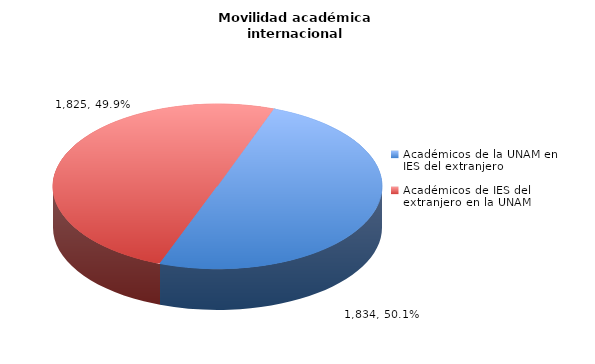
| Category | Series 0 |
|---|---|
| Académicos de la UNAM en IES del extranjero | 1834 |
| Académicos de IES del extranjero en la UNAM | 1825 |